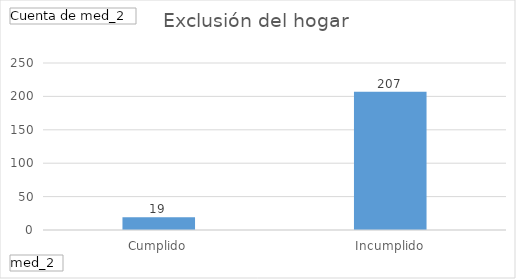
| Category | Total |
|---|---|
| Cumplido | 19 |
| Incumplido | 207 |